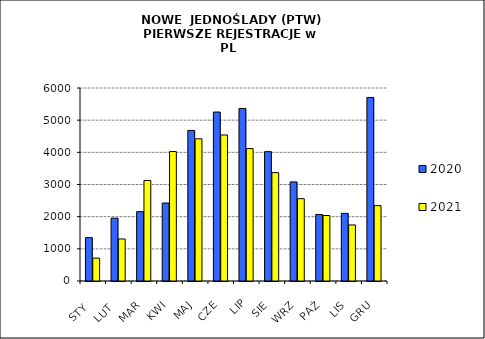
| Category | 2020 | 2021 |
|---|---|---|
|  STY  | 1347 | 711 |
|  LUT  | 1953 | 1307 |
| MAR | 2157 | 3125 |
| KWI | 2424 | 4024 |
| MAJ | 4682 | 4420 |
| CZE | 5252 | 4539 |
| LIP | 5365 | 4116 |
| SIE | 4021 | 3369 |
| WRZ | 3080 | 2558 |
| PAŹ | 2065 | 2035 |
| LIS | 2103 | 1742 |
| GRU | 5706 | 2343 |